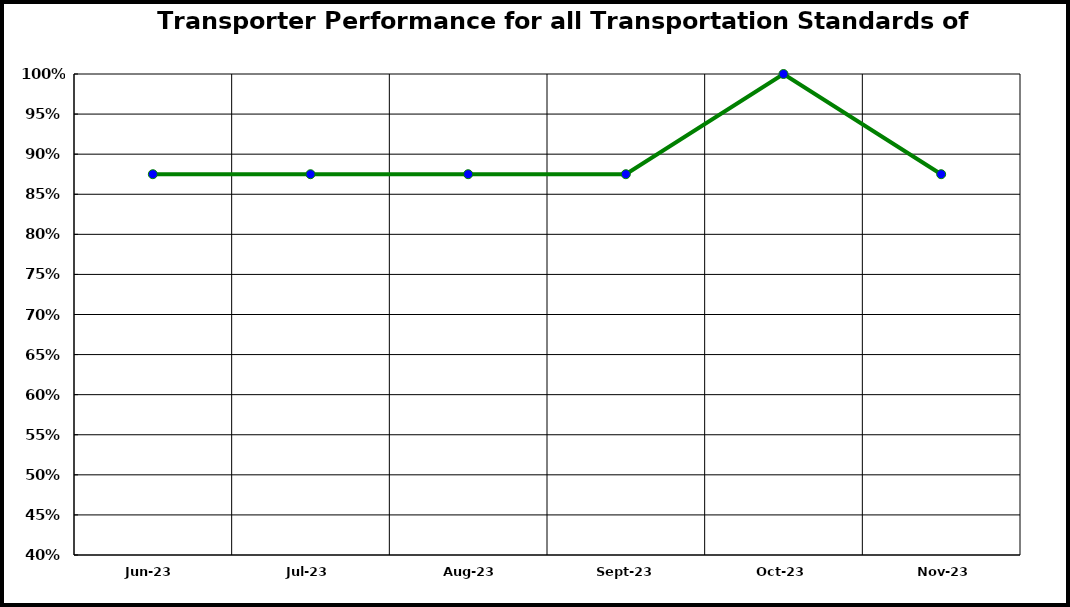
| Category | Performance |
|---|---|
| 2023-06-01 | 0.875 |
| 2023-07-01 | 0.875 |
| 2023-08-01 | 0.875 |
| 2023-09-01 | 0.875 |
| 2023-10-01 | 1 |
| 2023-11-01 | 0.875 |